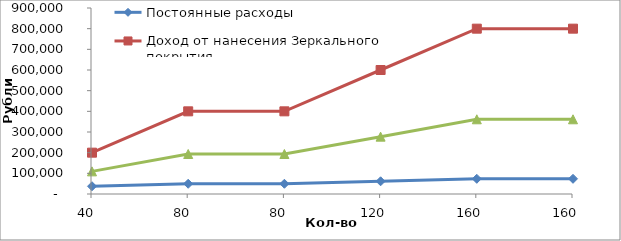
| Category | Постоянные расходы | Доход от нанесения Зеркального покрытия | Постоянные+переменные расходы |
|---|---|---|---|
| 40.0 | 37500 | 200000 | 109500 |
| 80.0 | 49500 | 400000 | 193500 |
| 80.0 | 49500 | 400000 | 193500 |
| 120.0 | 61500 | 600000 | 277500 |
| 160.0 | 73500 | 800000 | 361500 |
| 160.0 | 73500 | 800000 | 361500 |